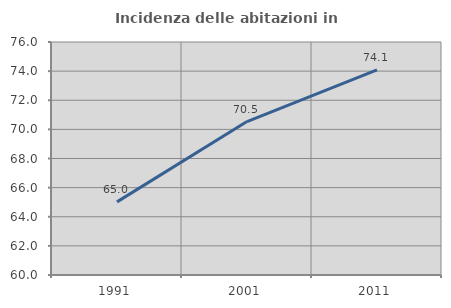
| Category | Incidenza delle abitazioni in proprietà  |
|---|---|
| 1991.0 | 65.02 |
| 2001.0 | 70.534 |
| 2011.0 | 74.086 |